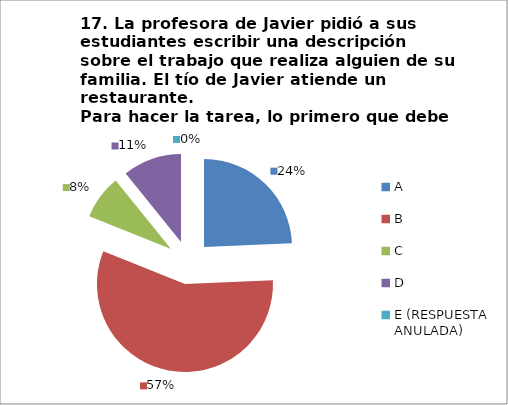
| Category | CANTIDAD DE RESPUESTAS PREGUNTA (17) | PORCENTAJE |
|---|---|---|
| A | 9 | 0.243 |
| B | 21 | 0.568 |
| C | 3 | 0.081 |
| D | 4 | 0.108 |
| E (RESPUESTA ANULADA) | 0 | 0 |